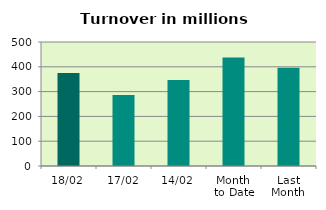
| Category | Series 0 |
|---|---|
| 18/02 | 375.453 |
| 17/02 | 286.266 |
| 14/02 | 346.967 |
| Month 
to Date | 437.292 |
| Last
Month | 396.049 |